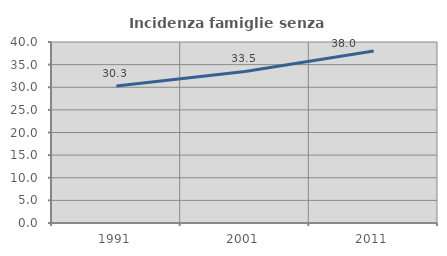
| Category | Incidenza famiglie senza nuclei |
|---|---|
| 1991.0 | 30.299 |
| 2001.0 | 33.499 |
| 2011.0 | 38.017 |